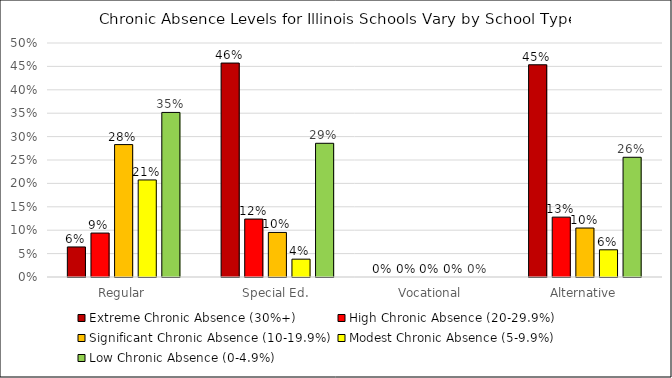
| Category | Extreme Chronic Absence (30%+) | High Chronic Absence (20-29.9%) | Significant Chronic Absence (10-19.9%) | Modest Chronic Absence (5-9.9%) | Low Chronic Absence (0-4.9%) |
|---|---|---|---|---|---|
| Regular | 0.064 | 0.094 | 0.283 | 0.207 | 0.352 |
| Special Ed. | 0.457 | 0.124 | 0.095 | 0.038 | 0.286 |
| Vocational | 0 | 0 | 0 | 0 | 0 |
| Alternative | 0.453 | 0.128 | 0.105 | 0.058 | 0.256 |